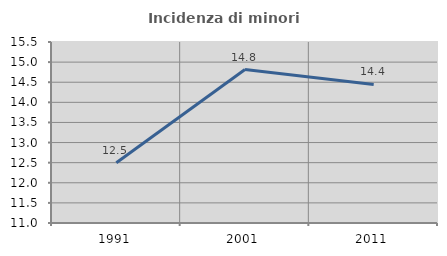
| Category | Incidenza di minori stranieri |
|---|---|
| 1991.0 | 12.5 |
| 2001.0 | 14.815 |
| 2011.0 | 14.444 |